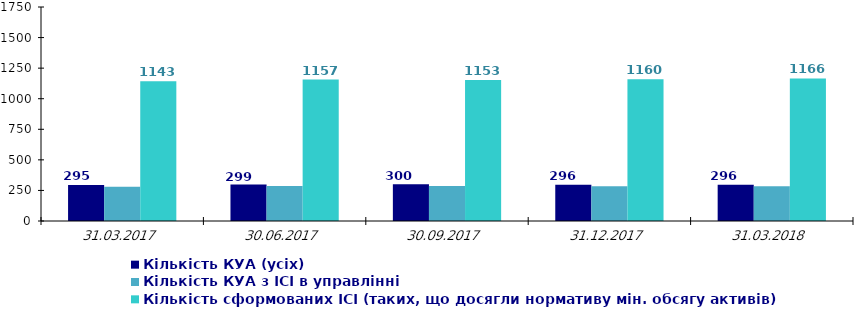
| Category | Кількість зареєстрованих ІСІ на одну КУА | Кількість КУА (усіх) | Кількість КУА з ІСІ в управлінні | Кількість сформованих ІСІ (таких, що досягли нормативу мін. обсягу активів)  |
|---|---|---|---|---|
| 31.03.2017 |  | 295 | 280 | 1143 |
| 30.06.2017 |  | 299 | 287 | 1157 |
| 30.09.2017 |  | 300 | 287 | 1153 |
| 31.12.2017 |  | 296 | 284 | 1160 |
| 31.03.2018 |  | 296 | 284 | 1166 |